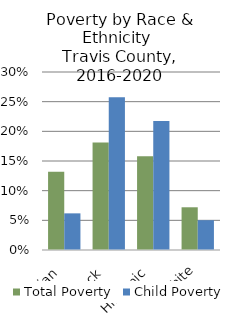
| Category | Total Poverty | Child Poverty |
|---|---|---|
| Asian  | 0.132 | 0.062 |
| Black  | 0.181 | 0.257 |
| Hispanic  | 0.158 | 0.218 |
| White | 0.072 | 0.05 |